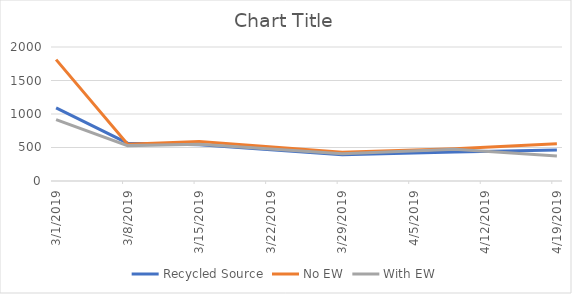
| Category | Recycled Source | No EW | With EW |
|---|---|---|---|
| 3/1/19 | 1092 | 1812 | 916 |
| 3/8/19 | 564 | 548 | 528 |
| 3/15/19 | 540 | 588 | 548 |
| 3/29/19 | 392 | 428 | 408 |
| 4/9/19 | 432 | 480 | 472 |
| 4/19/19 | 464 | 556 | 372 |